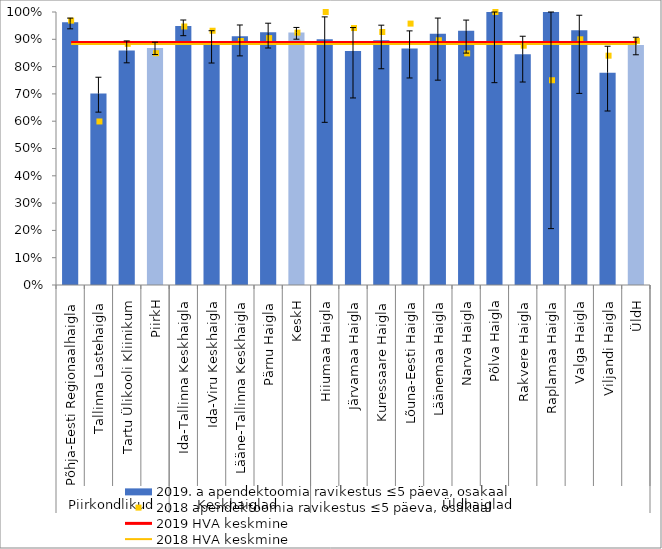
| Category | 2019. a apendektoomia ravikestus ≤5 päeva, osakaal |
|---|---|
| 0 | 0.963 |
| 1 | 0.701 |
| 2 | 0.859 |
| 3 | 0.868 |
| 4 | 0.949 |
| 5 | 0.885 |
| 6 | 0.911 |
| 7 | 0.925 |
| 8 | 0.925 |
| 9 | 0.9 |
| 10 | 0.857 |
| 11 | 0.897 |
| 12 | 0.867 |
| 13 | 0.92 |
| 14 | 0.932 |
| 15 | 1 |
| 16 | 0.845 |
| 17 | 1 |
| 18 | 0.933 |
| 19 | 0.778 |
| 20 | 0.879 |